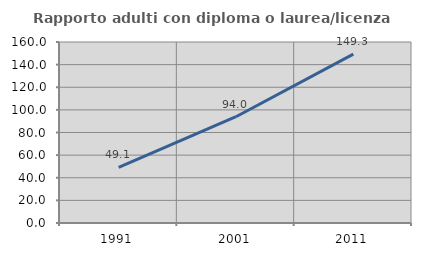
| Category | Rapporto adulti con diploma o laurea/licenza media  |
|---|---|
| 1991.0 | 49.078 |
| 2001.0 | 93.964 |
| 2011.0 | 149.318 |